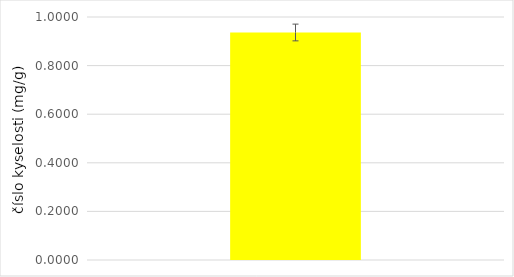
| Category | Číslo kyselosti (mg/g) |
|---|---|
| 0 | 0.936 |